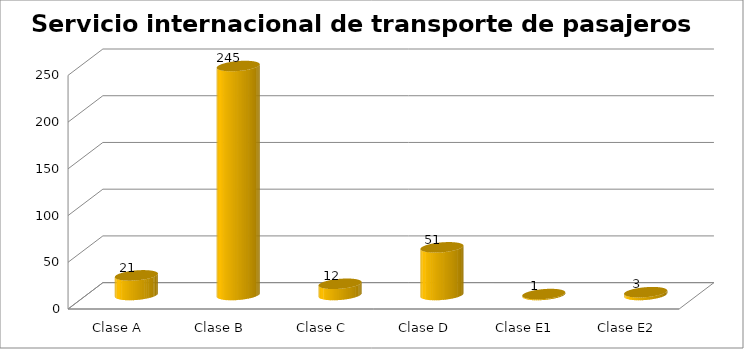
| Category | Series 0 |
|---|---|
| Clase A | 21 |
| Clase B | 245 |
| Clase C | 12 |
| Clase D | 51 |
| Clase E1 | 1 |
| Clase E2 | 3 |